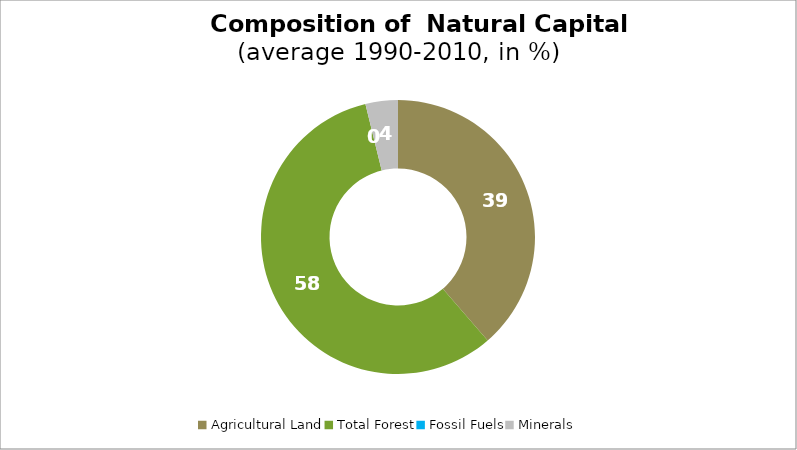
| Category | Series 0 |
|---|---|
| Agricultural Land | 38.645 |
| Total Forest | 57.53 |
| Fossil Fuels | 0.001 |
| Minerals | 3.823 |